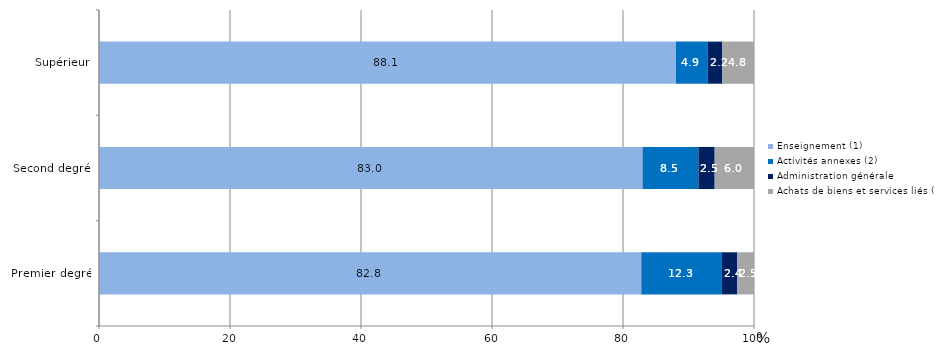
| Category | Enseignement (1) | Activités annexes (2) | Administration générale | Achats de biens et services liés (3) |
|---|---|---|---|---|
| Premier degré | 82.792 | 12.313 | 2.354 | 2.541 |
| Second degré | 82.987 | 8.525 | 2.483 | 6.005 |
| Supérieur | 88.085 | 4.868 | 2.211 | 4.836 |